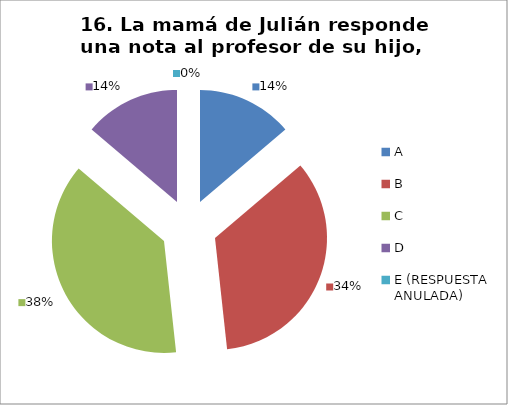
| Category | CANTIDAD DE RESPUESTAS PREGUNTA (16) | PORCENTAJE |
|---|---|---|
| A | 4 | 0.138 |
| B | 10 | 0.345 |
| C | 11 | 0.379 |
| D | 4 | 0.138 |
| E (RESPUESTA ANULADA) | 0 | 0 |